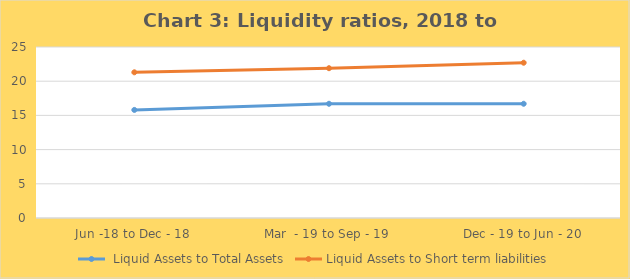
| Category |  Liquid Assets to Total Assets | Liquid Assets to Short term liabilities |
|---|---|---|
| Jun -18 to Dec - 18 | 15.8 | 21.3 |
| Mar  - 19 to Sep - 19 | 16.7 | 21.9 |
| Dec - 19 to Jun - 20 | 16.7 | 22.7 |